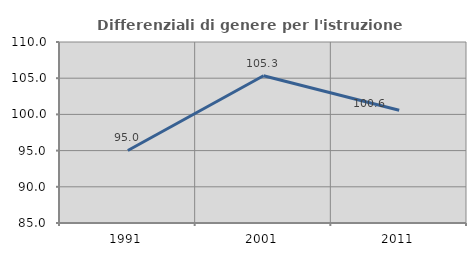
| Category | Differenziali di genere per l'istruzione superiore |
|---|---|
| 1991.0 | 95.018 |
| 2001.0 | 105.334 |
| 2011.0 | 100.57 |